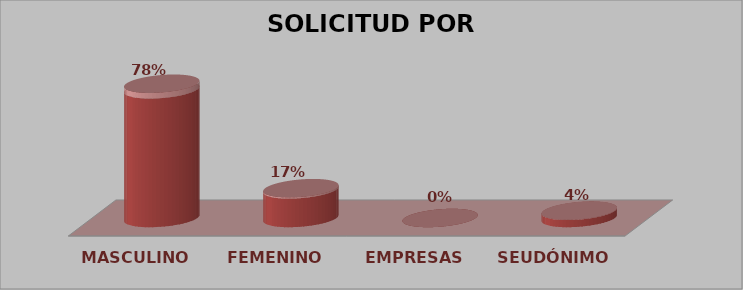
| Category | SOLICITUD POR GÉNERO | Series 1 |
|---|---|---|
| MASCULINO | 18 | 0.783 |
| FEMENINO | 4 | 0.174 |
| EMPRESAS | 0 | 0 |
| SEUDÓNIMO | 1 | 0.043 |